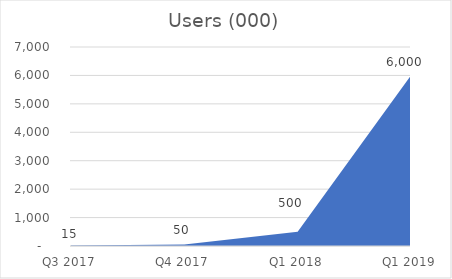
| Category | Users |
|---|---|
|  Q3 2017  | 15 |
|  Q4 2017  | 50 |
|  Q1 2018  | 500 |
|  Q1 2019  | 6000 |